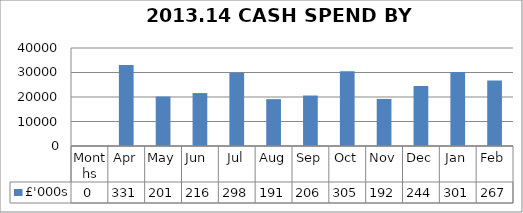
| Category | £'000s |
|---|---|
| Months | 0 |
| Apr | 33112 |
| May | 20192 |
| Jun  | 21610 |
| Jul | 29892 |
| Aug | 19122 |
| Sep | 20606 |
| Oct | 30510 |
| Nov | 19202 |
| Dec | 24480 |
| Jan | 30179 |
| Feb | 26716 |